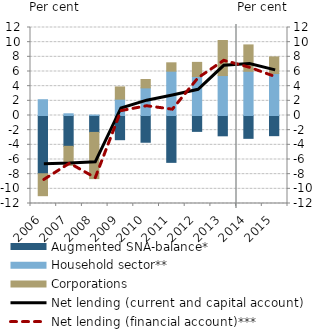
| Category | Augmented SNA-balance* | Household sector** | Corporations |
|---|---|---|---|
| 2006.0 | -7.944 | 2.151 | -2.991 |
| 2007.0 | -4.201 | 0.235 | -2.6 |
| 2008.0 | -2.306 | 0.065 | -6.303 |
| 2009.0 | -3.3 | 2.231 | 1.663 |
| 2010.0 | -3.647 | 3.767 | 1.144 |
| 2011.0 | -6.39 | 6.043 | 1.142 |
| 2012.0 | -2.165 | 5.313 | 1.931 |
| 2013.0 | -2.77 | 5.449 | 4.777 |
| 2014.0 | -3.114 | 6.029 | 3.597 |
| 2015.0 | -2.751 | 5.721 | 2.271 |